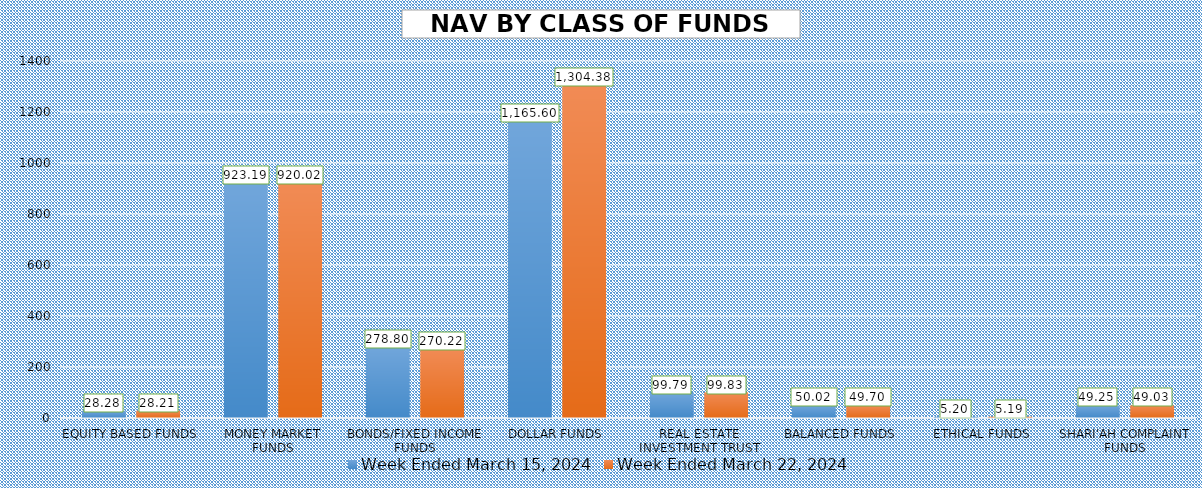
| Category | Week Ended March 15, 2024 | Week Ended March 22, 2024 |
|---|---|---|
| EQUITY BASED FUNDS | 28.276 | 28.215 |
| MONEY MARKET FUNDS | 923.191 | 920.024 |
| BONDS/FIXED INCOME FUNDS | 278.795 | 270.221 |
| DOLLAR FUNDS | 1165.595 | 1304.384 |
| REAL ESTATE INVESTMENT TRUST | 99.793 | 99.828 |
| BALANCED FUNDS | 50.02 | 49.695 |
| ETHICAL FUNDS | 5.201 | 5.194 |
| SHARI'AH COMPLAINT FUNDS | 49.249 | 49.029 |